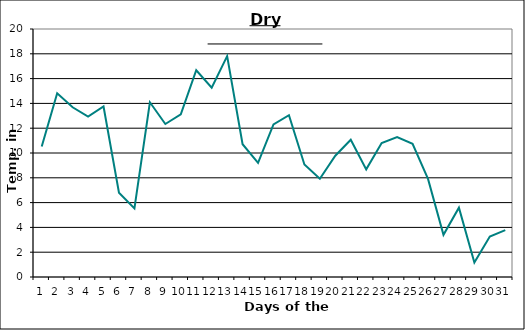
| Category | Series 0 |
|---|---|
| 0 | 10.53 |
| 1 | 14.82 |
| 2 | 13.69 |
| 3 | 12.94 |
| 4 | 13.75 |
| 5 | 6.8 |
| 6 | 5.53 |
| 7 | 14.09 |
| 8 | 12.34 |
| 9 | 13.11 |
| 10 | 16.67 |
| 11 | 15.27 |
| 12 | 17.81 |
| 13 | 10.71 |
| 14 | 9.2 |
| 15 | 12.3 |
| 16 | 13.05 |
| 17 | 9.07 |
| 18 | 7.92 |
| 19 | 9.78 |
| 20 | 11.07 |
| 21 | 8.68 |
| 22 | 10.81 |
| 23 | 11.29 |
| 24 | 10.74 |
| 25 | 7.91 |
| 26 | 3.4 |
| 27 | 5.59 |
| 28 | 1.17 |
| 29 | 3.26 |
| 30 | 3.78 |